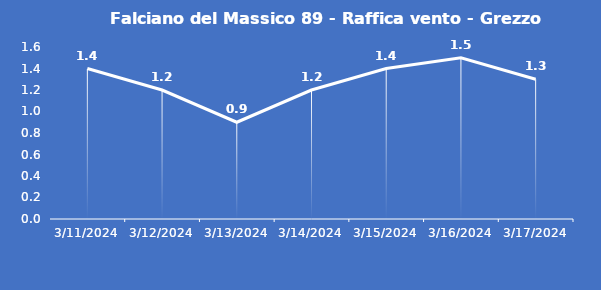
| Category | Falciano del Massico 89 - Raffica vento - Grezzo (m/s) |
|---|---|
| 3/11/24 | 1.4 |
| 3/12/24 | 1.2 |
| 3/13/24 | 0.9 |
| 3/14/24 | 1.2 |
| 3/15/24 | 1.4 |
| 3/16/24 | 1.5 |
| 3/17/24 | 1.3 |